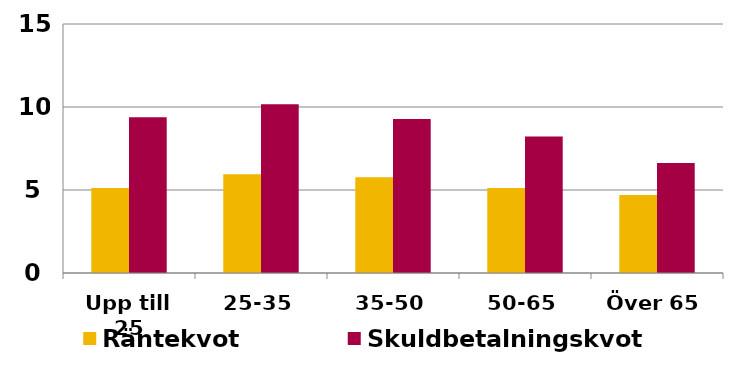
| Category | Räntekvot | Skuldbetalningskvot |
|---|---|---|
| Upp till 25 | 5.119 | 9.376 |
| 25-35 | 5.95 | 10.163 |
| 35-50 | 5.775 | 9.274 |
| 50-65 | 5.115 | 8.221 |
| Över 65 | 4.702 | 6.632 |